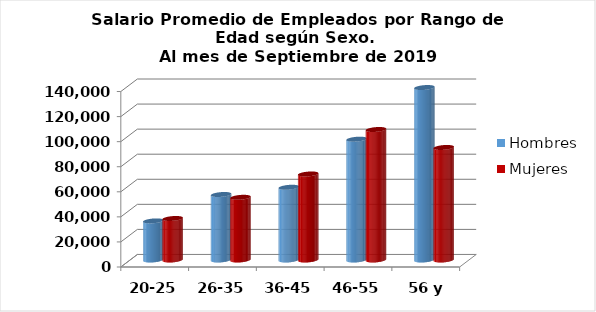
| Category | Hombres | Mujeres |
|---|---|---|
| 20-25 | 31206.385 | 33125.167 |
| 26-35 | 52265.321 | 50023.851 |
| 36-45 | 58034.471 | 68633.55 |
| 46-55 | 96403 | 104123.161 |
| 56 y más | 137602.4 | 89786.143 |